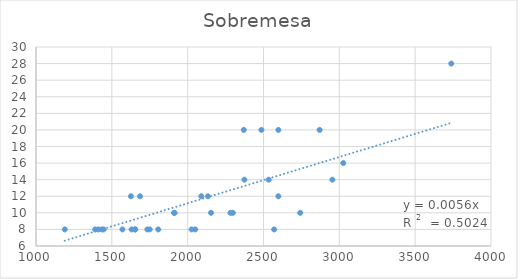
| Category | Sobremesa |
|---|---|
| 2870.0 | 20 |
| 1570.0 | 8 |
| 2374.0 | 14 |
| 2026.0 | 8 |
| 1410.0 | 8 |
| 2598.0 | 20 |
| 2370.0 | 20 |
| 1910.0 | 10 |
| 3738.0 | 28 |
| 2570.0 | 8 |
| 1654.0 | 8 |
| 1630.0 | 8 |
| 1626.0 | 12 |
| 1390.0 | 8 |
| 2298.0 | 10 |
| 1190.0 | 8 |
| 2742.0 | 10 |
| 2486.0 | 20 |
| 1446.0 | 8 |
| 2534.0 | 14 |
| 2090.0 | 12 |
| 1806.0 | 8 |
| 1654.0 | 8 |
| 2050.0 | 8 |
| 2134.0 | 12 |
| 1434.0 | 8 |
| 1914.0 | 10 |
| 1734.0 | 8 |
| 2282.0 | 10 |
| 2954.0 | 14 |
| 1686.0 | 12 |
| 2598.0 | 12 |
| 1750.0 | 8 |
| 3026.0 | 16 |
| 2154.0 | 10 |